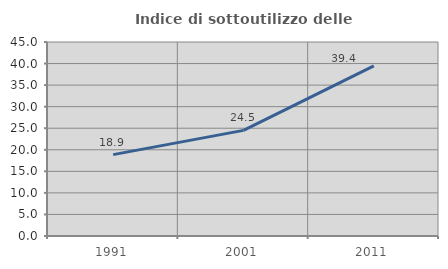
| Category | Indice di sottoutilizzo delle abitazioni  |
|---|---|
| 1991.0 | 18.877 |
| 2001.0 | 24.502 |
| 2011.0 | 39.443 |